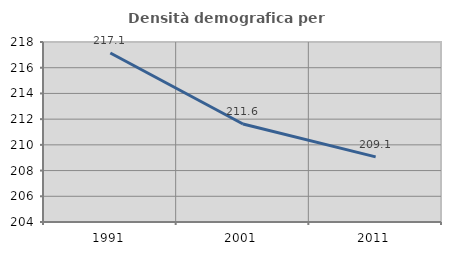
| Category | Densità demografica |
|---|---|
| 1991.0 | 217.145 |
| 2001.0 | 211.625 |
| 2011.0 | 209.067 |